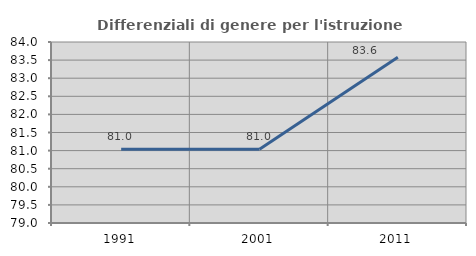
| Category | Differenziali di genere per l'istruzione superiore |
|---|---|
| 1991.0 | 81.038 |
| 2001.0 | 81.039 |
| 2011.0 | 83.58 |